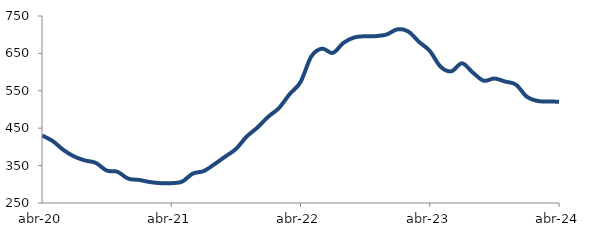
| Category | Series 0 |
|---|---|
| 2020-04-01 | 430.658 |
| 2020-05-01 | 415.426 |
| 2020-06-01 | 391.575 |
| 2020-07-01 | 374.117 |
| 2020-08-01 | 363.638 |
| 2020-09-01 | 357.239 |
| 2020-10-01 | 336.734 |
| 2020-11-01 | 333.458 |
| 2020-12-01 | 315.173 |
| 2021-01-01 | 311.708 |
| 2021-02-01 | 306.103 |
| 2021-03-01 | 303.075 |
| 2021-04-01 | 303.034 |
| 2021-05-01 | 306.996 |
| 2021-06-01 | 328.614 |
| 2021-07-01 | 335.232 |
| 2021-08-01 | 353.414 |
| 2021-09-01 | 373.869 |
| 2021-10-01 | 394.393 |
| 2021-11-01 | 427.592 |
| 2021-12-01 | 451.83 |
| 2022-01-01 | 480.528 |
| 2022-02-01 | 503.882 |
| 2022-03-01 | 541.428 |
| 2022-04-01 | 573.261 |
| 2022-05-01 | 641.774 |
| 2022-06-01 | 662.728 |
| 2022-07-01 | 651.267 |
| 2022-08-01 | 678.506 |
| 2022-09-01 | 692.688 |
| 2022-10-01 | 695.873 |
| 2022-11-01 | 696.235 |
| 2022-12-01 | 700.598 |
| 2023-01-01 | 714.422 |
| 2023-02-01 | 708.75 |
| 2023-03-01 | 680.994 |
| 2023-04-01 | 656.708 |
| 2023-05-01 | 614.698 |
| 2023-06-01 | 602.139 |
| 2023-07-01 | 623.52 |
| 2023-08-01 | 598.686 |
| 2023-09-01 | 577.1 |
| 2023-10-01 | 582.836 |
| 2023-11-01 | 574.767 |
| 2023-12-01 | 566.559 |
| 2024-01-01 | 534.515 |
| 2024-02-01 | 522.877 |
| 2024-03-01 | 521.351 |
| 2024-04-01 | 520.966 |